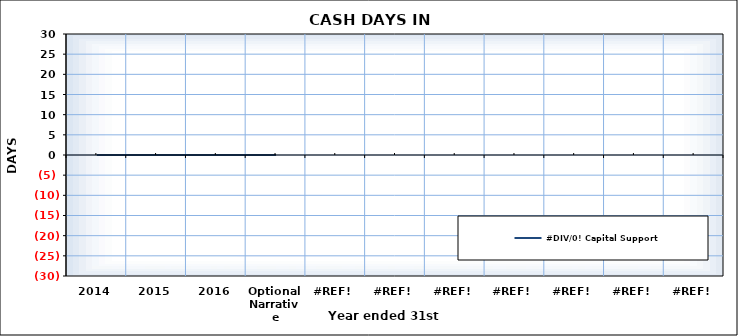
| Category | #DIV/0! Capital Support |
|---|---|
| 2014 |  |
| 2015 |  |
| 2016 |  |
| Optional Narrative |  |
| #REF! |  |
| #REF! |  |
| #REF! |  |
| #REF! |  |
| #REF! |  |
| #REF! |  |
| #REF! |  |